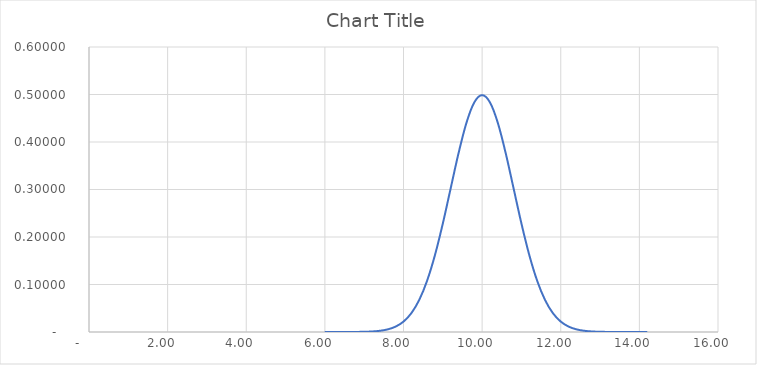
| Category | Series 0 |
|---|---|
| 6.0 | 0 |
| 6.2 | 0 |
| 6.4 | 0 |
| 6.6000000000000005 | 0 |
| 6.800000000000001 | 0 |
| 7.000000000000001 | 0 |
| 7.200000000000001 | 0.001 |
| 7.400000000000001 | 0.003 |
| 7.600000000000001 | 0.006 |
| 7.800000000000002 | 0.011 |
| 8.000000000000002 | 0.022 |
| 8.200000000000001 | 0.04 |
| 8.4 | 0.067 |
| 8.6 | 0.108 |
| 8.799999999999999 | 0.162 |
| 8.999999999999998 | 0.228 |
| 9.199999999999998 | 0.302 |
| 9.399999999999997 | 0.376 |
| 9.599999999999996 | 0.44 |
| 9.799999999999995 | 0.483 |
| 9.999999999999995 | 0.499 |
| 10.199999999999994 | 0.483 |
| 10.399999999999993 | 0.44 |
| 10.599999999999993 | 0.376 |
| 10.799999999999992 | 0.302 |
| 10.999999999999991 | 0.228 |
| 11.19999999999999 | 0.162 |
| 11.39999999999999 | 0.108 |
| 11.599999999999989 | 0.067 |
| 11.799999999999988 | 0.04 |
| 11.999999999999988 | 0.022 |
| 12.199999999999987 | 0.011 |
| 12.399999999999986 | 0.006 |
| 12.599999999999985 | 0.003 |
| 12.799999999999985 | 0.001 |
| 12.999999999999984 | 0 |
| 13.199999999999983 | 0 |
| 13.399999999999983 | 0 |
| 13.599999999999982 | 0 |
| 13.799999999999981 | 0 |
| 13.99999999999998 | 0 |
| 14.19999999999998 | 0 |